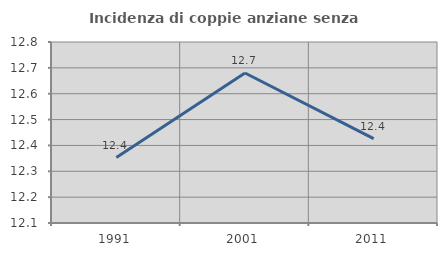
| Category | Incidenza di coppie anziane senza figli  |
|---|---|
| 1991.0 | 12.353 |
| 2001.0 | 12.68 |
| 2011.0 | 12.426 |